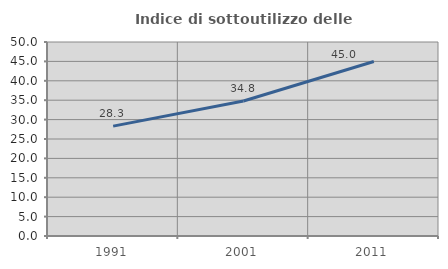
| Category | Indice di sottoutilizzo delle abitazioni  |
|---|---|
| 1991.0 | 28.319 |
| 2001.0 | 34.783 |
| 2011.0 | 44.961 |